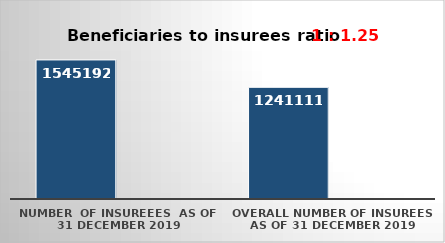
| Category | Series 0 | Series 1 |
|---|---|---|
| NUMBER  of insureees  as of  31 December 2019 | 1545192 |  |
| OVERALL number of insurees as of 31 December 2019 | 1241111 |  |